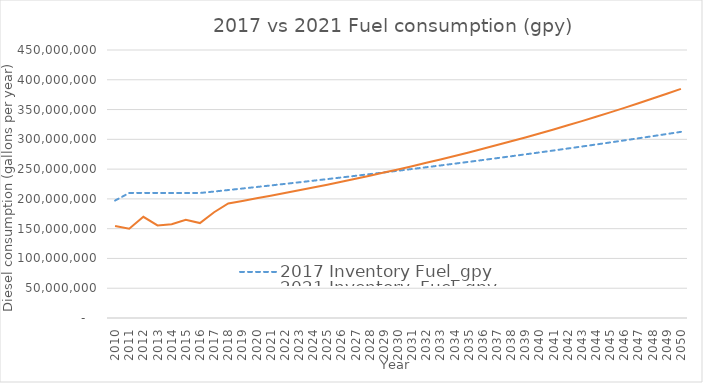
| Category | 2017 Inventory Fuel_gpy | 2021 Inventory  Fuel_gpy |
|---|---|---|
| 2010.0 | 197220605.243 | 154518520.117 |
| 2011.0 | 209997112.178 | 149815619.725 |
| 2012.0 | 209976112.467 | 169883603.504 |
| 2013.0 | 209955114.855 | 155401254.48 |
| 2014.0 | 209934119.344 | 157389810.12 |
| 2015.0 | 209913125.932 | 164756636.993 |
| 2016.0 | 209892134.619 | 159409119.12 |
| 2017.0 | 212364663.965 | 177548606.626 |
| 2018.0 | 214866319.707 | 192382050.201 |
| 2019.0 | 217397444.953 | 196594832.454 |
| 2020.0 | 219958386.854 | 200899866.07 |
| 2021.0 | 222549496.651 | 205299171.2 |
| 2022.0 | 225171129.722 | 209794812.59 |
| 2023.0 | 227823645.63 | 214388899.352 |
| 2024.0 | 230507408.176 | 219083587.463 |
| 2025.0 | 233222785.444 | 223881079.959 |
| 2026.0 | 235970149.857 | 228783627.774 |
| 2027.0 | 238749878.222 | 233793531.72 |
| 2028.0 | 241562351.787 | 238913142.554 |
| 2029.0 | 244407956.291 | 244144862.397 |
| 2030.0 | 247287082.016 | 249491146.621 |
| 2031.0 | 250200123.843 | 254954503.781 |
| 2032.0 | 253147481.301 | 260545921.923 |
| 2033.0 | 256129558.631 | 266252286.063 |
| 2034.0 | 259146764.832 | 272061353.956 |
| 2035.0 | 262199513.722 | 278030784.241 |
| 2036.0 | 265288223.993 | 284119102.561 |
| 2037.0 | 268413319.272 | 290361655.247 |
| 2038.0 | 271575228.173 | 296698624.185 |
| 2039.0 | 274774384.361 | 303171191.177 |
| 2040.0 | 278011226.609 | 309835110.702 |
| 2041.0 | 281286198.858 | 316647396.196 |
| 2042.0 | 284599750.281 | 323553222.09 |
| 2043.0 | 287952335.339 | 330608939.22 |
| 2044.0 | 291344413.849 | 337878709.997 |
| 2045.0 | 294776451.044 | 345277578.003 |
| 2046.0 | 298248917.638 | 352838466.38 |
| 2047.0 | 301762289.887 | 360564923.072 |
| 2048.0 | 305317049.662 | 368460573.869 |
| 2049.0 | 308913684.507 | 376494392.106 |
| 2050.0 | 312552687.711 | 384774358.241 |